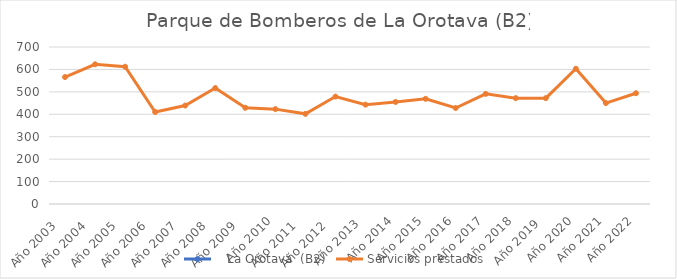
| Category |    La Orotava  (B2) | Servicios prestados  |
|---|---|---|
| Año 2003   |  | 566 |
| Año 2004   |  | 623 |
| Año 2005   |  | 612 |
| Año 2006   |  | 410 |
| Año 2007   |  | 439 |
| Año 2008   |  | 517 |
| Año 2009   |  | 429 |
| Año 2010 |  | 423 |
| Año 2011   |  | 402 |
| Año 2012   |  | 479 |
| Año 2013  |  | 443 |
| Año 2014 |  | 455 |
| Año 2015 |  | 469 |
| Año 2016 |  | 428 |
| Año 2017 |  | 491 |
| Año 2018 |  | 472 |
| Año 2019  |  | 472 |
| Año 2020 |  | 603 |
| Año 2021 |  | 450 |
| Año 2022 |  | 494 |